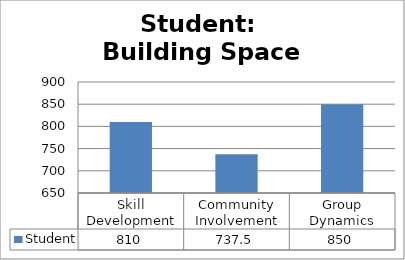
| Category | Student |
|---|---|
| Skill Development | 810 |
| Community Involvement | 737.5 |
| Group Dynamics | 850 |